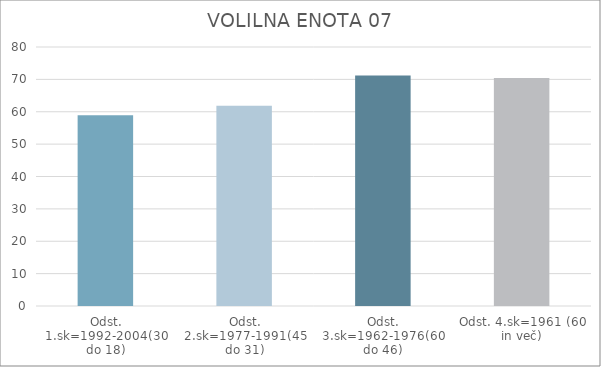
| Category | Series 0 |
|---|---|
| Odst. 1.sk=1992-2004(30 do 18) | 58.9 |
| Odst. 2.sk=1977-1991(45 do 31) | 61.83 |
| Odst. 3.sk=1962-1976(60 do 46) | 71.18 |
| Odst. 4.sk=1961 (60 in več) | 70.45 |